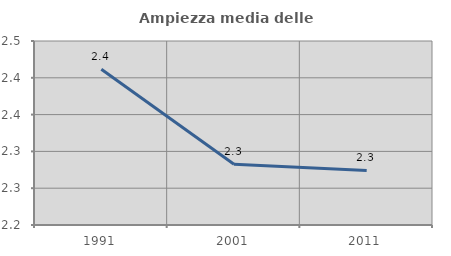
| Category | Ampiezza media delle famiglie |
|---|---|
| 1991.0 | 2.412 |
| 2001.0 | 2.283 |
| 2011.0 | 2.274 |